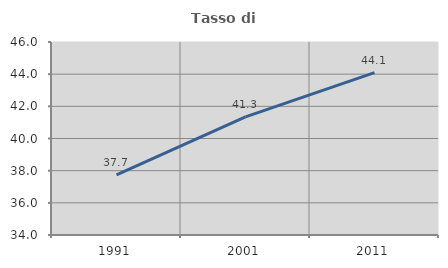
| Category | Tasso di occupazione   |
|---|---|
| 1991.0 | 37.74 |
| 2001.0 | 41.346 |
| 2011.0 | 44.1 |